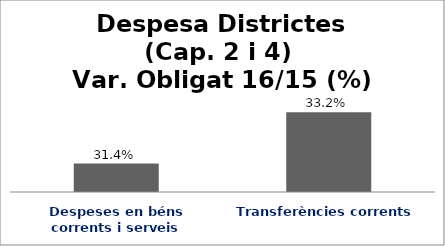
| Category | Series 0 |
|---|---|
| Despeses en béns corrents i serveis | 0.314 |
| Transferències corrents | 0.332 |